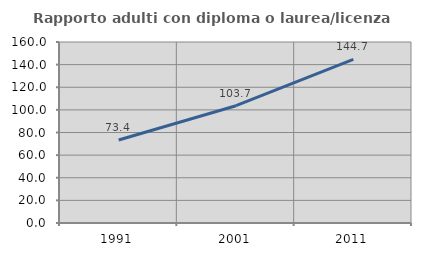
| Category | Rapporto adulti con diploma o laurea/licenza media  |
|---|---|
| 1991.0 | 73.377 |
| 2001.0 | 103.683 |
| 2011.0 | 144.682 |